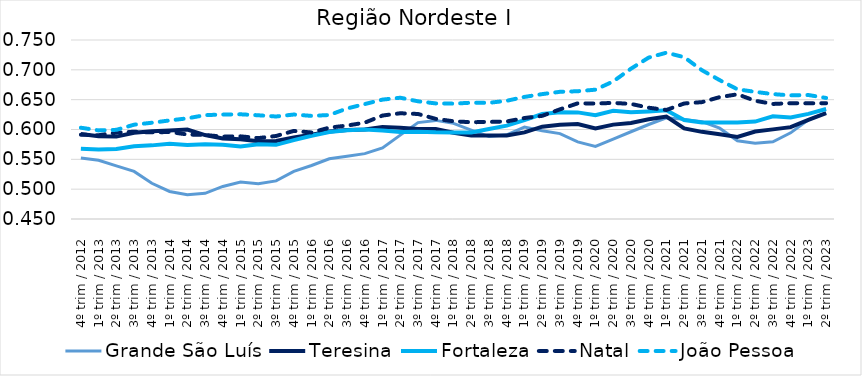
| Category | Grande São Luís | Teresina | Fortaleza | Natal | João Pessoa |
|---|---|---|---|---|---|
| 4º trim / 2012 | 0.552 | 0.593 | 0.568 | 0.591 | 0.603 |
| 1º trim / 2013 | 0.548 | 0.589 | 0.567 | 0.59 | 0.598 |
| 2º trim / 2013 | 0.539 | 0.588 | 0.567 | 0.595 | 0.599 |
| 3º trim / 2013 | 0.53 | 0.594 | 0.572 | 0.596 | 0.608 |
| 4º trim / 2013 | 0.51 | 0.597 | 0.573 | 0.595 | 0.611 |
| 1º trim / 2014 | 0.496 | 0.598 | 0.576 | 0.596 | 0.615 |
| 2º trim / 2014 | 0.491 | 0.6 | 0.574 | 0.592 | 0.619 |
| 3º trim / 2014 | 0.493 | 0.591 | 0.575 | 0.591 | 0.624 |
| 4º trim / 2014 | 0.505 | 0.585 | 0.575 | 0.588 | 0.625 |
| 1º trim / 2015 | 0.512 | 0.584 | 0.571 | 0.589 | 0.625 |
| 2º trim / 2015 | 0.509 | 0.58 | 0.575 | 0.586 | 0.624 |
| 3º trim / 2015 | 0.514 | 0.581 | 0.574 | 0.589 | 0.622 |
| 4º trim / 2015 | 0.53 | 0.586 | 0.582 | 0.598 | 0.625 |
| 1º trim / 2016 | 0.54 | 0.591 | 0.589 | 0.595 | 0.623 |
| 2º trim / 2016 | 0.551 | 0.597 | 0.596 | 0.603 | 0.624 |
| 3º trim / 2016 | 0.555 | 0.599 | 0.599 | 0.607 | 0.635 |
| 4º trim / 2016 | 0.56 | 0.6 | 0.6 | 0.611 | 0.643 |
| 1º trim / 2017 | 0.569 | 0.604 | 0.598 | 0.623 | 0.65 |
| 2º trim / 2017 | 0.591 | 0.603 | 0.596 | 0.627 | 0.653 |
| 3º trim / 2017 | 0.612 | 0.601 | 0.596 | 0.626 | 0.647 |
| 4º trim / 2017 | 0.615 | 0.601 | 0.595 | 0.618 | 0.644 |
| 1º trim / 2018 | 0.61 | 0.595 | 0.595 | 0.614 | 0.643 |
| 2º trim / 2018 | 0.599 | 0.59 | 0.595 | 0.612 | 0.645 |
| 3º trim / 2018 | 0.588 | 0.59 | 0.601 | 0.613 | 0.645 |
| 4º trim / 2018 | 0.591 | 0.59 | 0.606 | 0.613 | 0.648 |
| 1º trim / 2019 | 0.604 | 0.595 | 0.616 | 0.619 | 0.655 |
| 2º trim / 2019 | 0.598 | 0.605 | 0.626 | 0.623 | 0.659 |
| 3º trim / 2019 | 0.593 | 0.608 | 0.629 | 0.634 | 0.663 |
| 4º trim / 2019 | 0.579 | 0.609 | 0.629 | 0.644 | 0.664 |
| 1º trim / 2020 | 0.572 | 0.602 | 0.624 | 0.644 | 0.667 |
| 2º trim / 2020 | 0.584 | 0.608 | 0.632 | 0.645 | 0.681 |
| 3º trim / 2020 | 0.596 | 0.611 | 0.629 | 0.643 | 0.702 |
| 4º trim / 2020 | 0.608 | 0.617 | 0.63 | 0.637 | 0.721 |
| 1º trim / 2021 | 0.62 | 0.622 | 0.632 | 0.633 | 0.729 |
| 2º trim / 2021 | 0.617 | 0.602 | 0.616 | 0.644 | 0.721 |
| 3º trim / 2021 | 0.613 | 0.596 | 0.612 | 0.646 | 0.699 |
| 4º trim / 2021 | 0.602 | 0.592 | 0.612 | 0.654 | 0.683 |
| 1º trim / 2022 | 0.581 | 0.588 | 0.612 | 0.659 | 0.667 |
| 2º trim / 2022 | 0.577 | 0.597 | 0.613 | 0.648 | 0.663 |
| 3º trim / 2022 | 0.579 | 0.6 | 0.622 | 0.643 | 0.659 |
| 4º trim / 2022 | 0.594 | 0.604 | 0.62 | 0.644 | 0.657 |
| 1º trim / 2023 | 0.616 | 0.616 | 0.626 | 0.644 | 0.658 |
| 2º trim / 2023 | 0.628 | 0.627 | 0.634 | 0.644 | 0.653 |